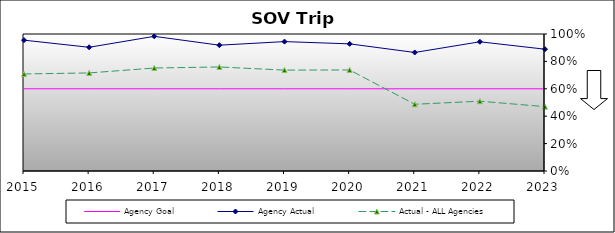
| Category | Agency Goal | Agency Actual | Actual - ALL Agencies |
|---|---|---|---|
| 2015.0 | 0.6 | 0.955 | 0.708 |
| 2016.0 | 0.6 | 0.903 | 0.716 |
| 2017.0 | 0.6 | 0.983 | 0.752 |
| 2018.0 | 0.6 | 0.918 | 0.759 |
| 2019.0 | 0.6 | 0.944 | 0.736 |
| 2020.0 | 0.6 | 0.928 | 0.737 |
| 2021.0 | 0.6 | 0.865 | 0.487 |
| 2022.0 | 0.6 | 0.943 | 0.509 |
| 2023.0 | 0.6 | 0.889 | 0.47 |